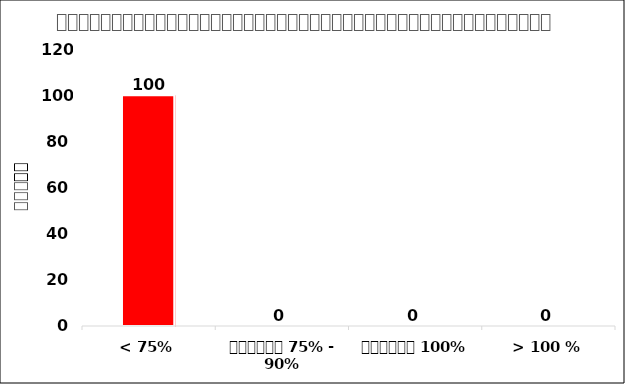
| Category | Percentage  |
|---|---|
| < 75% | 100 |
| ចន្លោះ 75% - 90% | 0 |
| ពេញលេញ 100% | 0 |
| > 100 % | 0 |